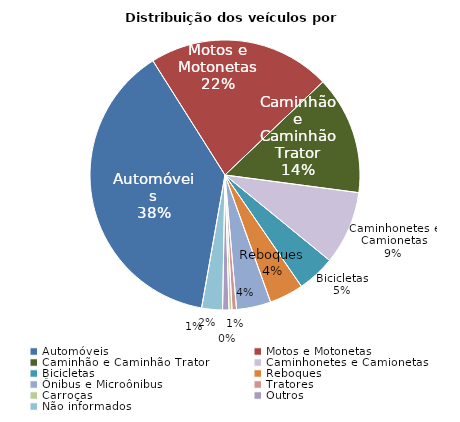
| Category | Series 0 |
|---|---|
| Automóveis | 1199 |
| Motos e Motonetas | 685 |
| Caminhão e Caminhão Trator | 445 |
| Caminhonetes e Camionetas | 276 |
| Bicicletas | 142 |
| Reboques | 128 |
| Ônibus e Microônibus | 129 |
| Tratores | 17 |
| Carroças | 11 |
| Outros | 24 |
| Não informados | 78 |